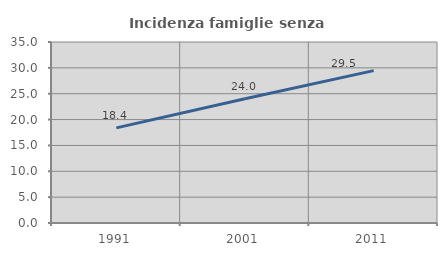
| Category | Incidenza famiglie senza nuclei |
|---|---|
| 1991.0 | 18.393 |
| 2001.0 | 24.012 |
| 2011.0 | 29.466 |